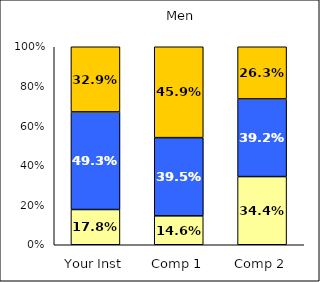
| Category | Low Academic Self-Concept | Average Academic Self-Concept | High Academic Self-Concept |
|---|---|---|---|
| Your Inst | 0.178 | 0.493 | 0.329 |
| Comp 1 | 0.146 | 0.395 | 0.459 |
| Comp 2 | 0.344 | 0.392 | 0.263 |